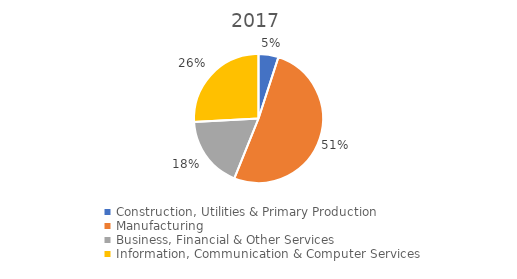
| Category | Series 0 |
|---|---|
| Construction, Utilities & Primary Production  | 18954 |
| Manufacturing  | 194138 |
| Business, Financial & Other Services | 68443 |
| Information, Communication & Computer Services | 98275 |